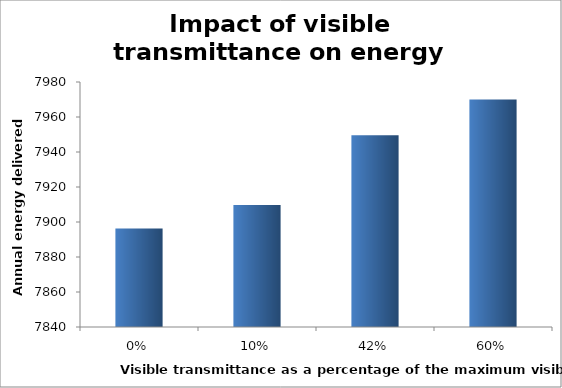
| Category | Series 0 |
|---|---|
| 0.0 | 7896.32 |
| 0.1 | 7909.75 |
| 0.42 | 7949.63 |
| 0.6 | 7970 |